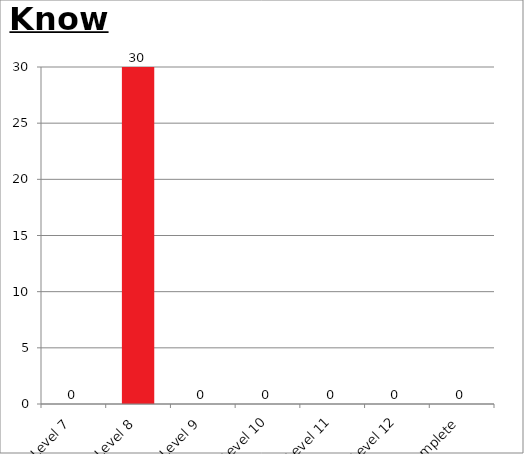
| Category | Series 0 |
|---|---|
| Level 7 | 0 |
| Level 8 | 30 |
| Level 9 | 0 |
| Level 10 | 0 |
| Level 11 | 0 |
| Level 12 | 0 |
| Complete | 0 |